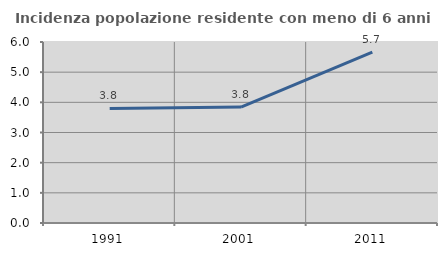
| Category | Incidenza popolazione residente con meno di 6 anni |
|---|---|
| 1991.0 | 3.798 |
| 2001.0 | 3.843 |
| 2011.0 | 5.665 |